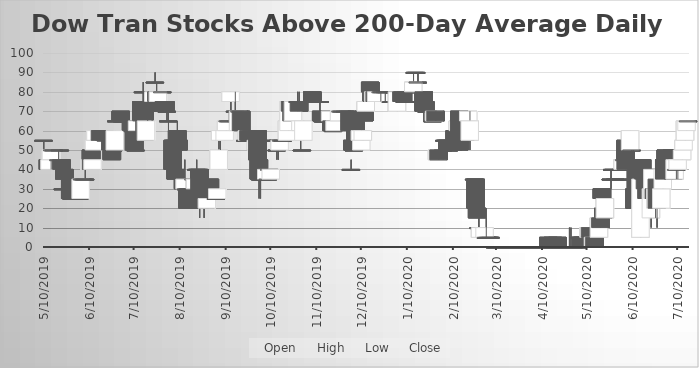
| Category | Open | High | Low | Close |
|---|---|---|---|---|
| 5/10/19 | 55 | 55 | 45 | 55 |
| 5/13/19 | 45 | 45 | 40 | 40 |
| 5/14/19 | 40 | 50 | 40 | 45 |
| 5/15/19 | 45 | 50 | 40 | 50 |
| 5/16/19 | 50 | 50 | 50 | 50 |
| 5/17/19 | 50 | 50 | 50 | 50 |
| 5/20/19 | 45 | 50 | 40 | 45 |
| 5/21/19 | 50 | 50 | 50 | 50 |
| 5/22/19 | 45 | 45 | 35 | 40 |
| 5/23/19 | 30 | 40 | 25 | 30 |
| 5/24/19 | 40 | 40 | 25 | 35 |
| 5/28/19 | 35 | 35 | 25 | 25 |
| 5/29/19 | 25 | 25 | 25 | 25 |
| 5/30/19 | 25 | 25 | 25 | 25 |
| 5/31/19 | 25 | 25 | 25 | 25 |
| 6/3/19 | 25 | 25 | 25 | 25 |
| 6/4/19 | 25 | 35 | 25 | 35 |
| 6/5/19 | 35 | 35 | 35 | 35 |
| 6/6/19 | 35 | 35 | 35 | 35 |
| 6/7/19 | 35 | 40 | 35 | 35 |
| 6/10/19 | 40 | 45 | 40 | 45 |
| 6/11/19 | 50 | 50 | 40 | 40 |
| 6/12/19 | 40 | 45 | 40 | 45 |
| 6/13/19 | 50 | 55 | 50 | 55 |
| 6/14/19 | 55 | 60 | 55 | 60 |
| 6/17/19 | 60 | 60 | 55 | 55 |
| 6/18/19 | 60 | 60 | 60 | 60 |
| 6/19/19 | 60 | 60 | 55 | 60 |
| 6/20/19 | 60 | 60 | 55 | 55 |
| 6/21/19 | 55 | 55 | 55 | 55 |
| 6/24/19 | 55 | 55 | 50 | 50 |
| 6/25/19 | 50 | 55 | 45 | 45 |
| 6/26/19 | 50 | 50 | 50 | 50 |
| 6/27/19 | 50 | 60 | 50 | 60 |
| 6/28/19 | 65 | 65 | 65 | 65 |
| 7/1/19 | 70 | 70 | 65 | 65 |
| 7/2/19 | 65 | 65 | 65 | 65 |
| 7/3/19 | 65 | 65 | 65 | 65 |
| 7/5/19 | 65 | 65 | 65 | 65 |
| 7/8/19 | 65 | 65 | 60 | 60 |
| 7/9/19 | 60 | 60 | 60 | 60 |
| 7/10/19 | 60 | 60 | 50 | 50 |
| 7/11/19 | 50 | 55 | 50 | 50 |
| 7/12/19 | 60 | 65 | 60 | 65 |
| 7/15/19 | 75 | 75 | 60 | 65 |
| 7/16/19 | 80 | 85 | 75 | 80 |
| 7/17/19 | 75 | 75 | 55 | 55 |
| 7/18/19 | 55 | 70 | 55 | 65 |
| 7/19/19 | 75 | 75 | 65 | 70 |
| 7/22/19 | 75 | 75 | 65 | 70 |
| 7/23/19 | 75 | 80 | 70 | 80 |
| 7/24/19 | 85 | 90 | 85 | 85 |
| 7/25/19 | 80 | 85 | 75 | 75 |
| 7/26/19 | 75 | 80 | 75 | 80 |
| 7/29/19 | 80 | 80 | 80 | 80 |
| 7/30/19 | 75 | 75 | 70 | 75 |
| 7/31/19 | 75 | 75 | 70 | 70 |
| 8/1/19 | 70 | 75 | 65 | 70 |
| 8/2/19 | 65 | 70 | 60 | 65 |
| 8/5/19 | 55 | 55 | 35 | 40 |
| 8/6/19 | 55 | 55 | 35 | 50 |
| 8/7/19 | 40 | 40 | 35 | 35 |
| 8/8/19 | 60 | 65 | 45 | 55 |
| 8/9/19 | 55 | 60 | 40 | 50 |
| 8/12/19 | 35 | 35 | 30 | 30 |
| 8/13/19 | 30 | 45 | 30 | 35 |
| 8/14/19 | 30 | 35 | 30 | 30 |
| 8/15/19 | 30 | 30 | 20 | 20 |
| 8/16/19 | 30 | 30 | 30 | 30 |
| 8/19/19 | 35 | 40 | 35 | 35 |
| 8/20/19 | 30 | 35 | 30 | 35 |
| 8/21/19 | 40 | 45 | 35 | 40 |
| 8/22/19 | 40 | 40 | 40 | 40 |
| 8/23/19 | 40 | 40 | 15 | 20 |
| 8/26/19 | 25 | 25 | 15 | 25 |
| 8/27/19 | 25 | 25 | 20 | 20 |
| 8/28/19 | 20 | 25 | 20 | 25 |
| 8/29/19 | 30 | 30 | 25 | 30 |
| 8/30/19 | 35 | 35 | 30 | 30 |
| 9/3/19 | 25 | 30 | 25 | 25 |
| 9/4/19 | 25 | 30 | 25 | 30 |
| 9/5/19 | 40 | 55 | 40 | 50 |
| 9/6/19 | 55 | 60 | 50 | 60 |
| 9/9/19 | 55 | 60 | 55 | 60 |
| 9/10/19 | 60 | 65 | 60 | 65 |
| 9/11/19 | 65 | 65 | 65 | 65 |
| 9/12/19 | 65 | 70 | 65 | 65 |
| 9/13/19 | 75 | 80 | 70 | 80 |
| 9/16/19 | 70 | 80 | 65 | 70 |
| 9/17/19 | 65 | 70 | 60 | 65 |
| 9/18/19 | 60 | 70 | 60 | 70 |
| 9/19/19 | 70 | 70 | 65 | 70 |
| 9/20/19 | 70 | 70 | 60 | 60 |
| 9/23/19 | 55 | 60 | 55 | 55 |
| 9/24/19 | 55 | 60 | 55 | 60 |
| 9/25/19 | 60 | 60 | 50 | 55 |
| 9/26/19 | 55 | 60 | 50 | 55 |
| 9/27/19 | 60 | 60 | 50 | 55 |
| 9/30/19 | 50 | 60 | 50 | 55 |
| 10/1/19 | 60 | 60 | 45 | 45 |
| 10/2/19 | 45 | 45 | 25 | 35 |
| 10/3/19 | 35 | 35 | 25 | 35 |
| 10/4/19 | 35 | 35 | 35 | 35 |
| 10/7/19 | 35 | 40 | 35 | 40 |
| 10/8/19 | 35 | 40 | 35 | 35 |
| 10/9/19 | 40 | 40 | 40 | 40 |
| 10/10/19 | 35 | 40 | 35 | 40 |
| 10/11/19 | 55 | 55 | 55 | 55 |
| 10/14/19 | 50 | 55 | 45 | 50 |
| 10/15/19 | 55 | 55 | 45 | 55 |
| 10/16/19 | 50 | 55 | 50 | 55 |
| 10/17/19 | 55 | 55 | 55 | 55 |
| 10/18/19 | 55 | 55 | 55 | 55 |
| 10/21/19 | 55 | 65 | 55 | 65 |
| 10/22/19 | 60 | 75 | 60 | 75 |
| 10/23/19 | 75 | 75 | 65 | 70 |
| 10/24/19 | 70 | 70 | 65 | 65 |
| 10/25/19 | 65 | 75 | 65 | 75 |
| 10/28/19 | 75 | 80 | 70 | 75 |
| 10/29/19 | 75 | 80 | 70 | 70 |
| 10/30/19 | 60 | 65 | 50 | 65 |
| 10/31/19 | 50 | 50 | 50 | 50 |
| 11/1/19 | 55 | 65 | 55 | 65 |
| 11/4/19 | 75 | 75 | 75 | 75 |
| 11/5/19 | 75 | 80 | 75 | 75 |
| 11/6/19 | 75 | 75 | 75 | 75 |
| 11/7/19 | 80 | 80 | 75 | 75 |
| 11/8/19 | 75 | 75 | 75 | 75 |
| 11/11/19 | 75 | 75 | 75 | 75 |
| 11/12/19 | 75 | 75 | 70 | 75 |
| 11/13/19 | 70 | 70 | 65 | 65 |
| 11/14/19 | 65 | 65 | 65 | 65 |
| 11/15/19 | 65 | 65 | 65 | 65 |
| 11/18/19 | 65 | 65 | 65 | 65 |
| 11/19/19 | 65 | 70 | 65 | 70 |
| 11/20/19 | 65 | 70 | 60 | 60 |
| 11/21/19 | 60 | 60 | 60 | 60 |
| 11/22/19 | 60 | 65 | 60 | 65 |
| 11/25/19 | 65 | 70 | 65 | 70 |
| 11/26/19 | 70 | 70 | 70 | 70 |
| 11/27/19 | 70 | 70 | 70 | 70 |
| 11/29/19 | 70 | 70 | 65 | 70 |
| 12/2/19 | 70 | 70 | 60 | 60 |
| 12/3/19 | 40 | 45 | 40 | 40 |
| 12/4/19 | 55 | 65 | 50 | 50 |
| 12/5/19 | 50 | 50 | 50 | 50 |
| 12/6/19 | 65 | 65 | 55 | 55 |
| 12/9/19 | 55 | 65 | 50 | 60 |
| 12/10/19 | 50 | 65 | 50 | 55 |
| 12/11/19 | 55 | 60 | 55 | 60 |
| 12/12/19 | 70 | 80 | 65 | 65 |
| 12/13/19 | 70 | 80 | 65 | 75 |
| 12/16/19 | 85 | 85 | 80 | 80 |
| 12/17/19 | 80 | 80 | 75 | 75 |
| 12/18/19 | 75 | 80 | 75 | 80 |
| 12/19/19 | 80 | 80 | 75 | 75 |
| 12/20/19 | 75 | 80 | 75 | 80 |
| 12/23/19 | 80 | 80 | 75 | 80 |
| 12/24/19 | 80 | 80 | 80 | 80 |
| 12/26/19 | 80 | 80 | 75 | 80 |
| 12/27/19 | 80 | 80 | 80 | 80 |
| 12/30/19 | 75 | 75 | 75 | 75 |
| 12/31/19 | 75 | 80 | 75 | 75 |
| 1/2/20 | 80 | 80 | 75 | 80 |
| 1/3/20 | 70 | 80 | 70 | 80 |
| 1/6/20 | 80 | 80 | 75 | 75 |
| 1/7/20 | 80 | 80 | 75 | 75 |
| 1/8/20 | 75 | 80 | 75 | 75 |
| 1/9/20 | 80 | 80 | 80 | 80 |
| 1/10/20 | 75 | 80 | 75 | 75 |
| 1/13/20 | 75 | 75 | 75 | 75 |
| 1/14/20 | 80 | 90 | 80 | 85 |
| 1/15/20 | 90 | 90 | 90 | 90 |
| 1/16/20 | 90 | 90 | 90 | 90 |
| 1/17/20 | 85 | 90 | 85 | 85 |
| 1/21/20 | 80 | 80 | 65 | 70 |
| 1/22/20 | 75 | 75 | 70 | 70 |
| 1/23/20 | 70 | 70 | 70 | 70 |
| 1/24/20 | 70 | 70 | 70 | 70 |
| 1/27/20 | 65 | 70 | 65 | 65 |
| 1/28/20 | 65 | 70 | 65 | 70 |
| 1/29/20 | 70 | 70 | 65 | 65 |
| 1/30/20 | 45 | 50 | 45 | 50 |
| 1/31/20 | 50 | 50 | 45 | 45 |
| 2/3/20 | 50 | 50 | 45 | 50 |
| 2/4/20 | 55 | 55 | 55 | 55 |
| 2/5/20 | 55 | 60 | 55 | 55 |
| 2/6/20 | 55 | 60 | 50 | 50 |
| 2/7/20 | 50 | 55 | 50 | 50 |
| 2/10/20 | 55 | 55 | 50 | 50 |
| 2/11/20 | 60 | 60 | 55 | 55 |
| 2/12/20 | 60 | 60 | 60 | 60 |
| 2/13/20 | 60 | 65 | 55 | 65 |
| 2/14/20 | 70 | 70 | 50 | 50 |
| 2/18/20 | 60 | 60 | 55 | 55 |
| 2/19/20 | 65 | 65 | 55 | 65 |
| 2/20/20 | 65 | 70 | 65 | 70 |
| 2/21/20 | 55 | 70 | 50 | 65 |
| 2/24/20 | 35 | 35 | 30 | 35 |
| 2/25/20 | 35 | 35 | 20 | 20 |
| 2/26/20 | 20 | 25 | 15 | 15 |
| 2/27/20 | 10 | 20 | 5 | 10 |
| 2/28/20 | 5 | 10 | 5 | 10 |
| 3/2/20 | 5 | 10 | 5 | 10 |
| 3/3/20 | 5 | 15 | 5 | 5 |
| 3/4/20 | 5 | 5 | 5 | 5 |
| 3/5/20 | 5 | 5 | 5 | 5 |
| 3/6/20 | 5 | 5 | 5 | 5 |
| 3/9/20 | 0.01 | 0.01 | 0.01 | 0.01 |
| 3/10/20 | 0.01 | 0.01 | 0.01 | 0.01 |
| 3/11/20 | 0.01 | 0.01 | 0.01 | 0.01 |
| 3/12/20 | 0.01 | 0.01 | 0.01 | 0.01 |
| 3/13/20 | 0.01 | 0.01 | 0.01 | 0.01 |
| 3/16/20 | 0.01 | 0.01 | 0.01 | 0.01 |
| 3/17/20 | 0.01 | 0.01 | 0.01 | 0.01 |
| 3/18/20 | 0.01 | 0.01 | 0.01 | 0.01 |
| 3/19/20 | 0.01 | 0.01 | 0.01 | 0.01 |
| 3/20/20 | 0.01 | 0.01 | 0.01 | 0.01 |
| 3/23/20 | 0.01 | 0.01 | 0.01 | 0.01 |
| 3/24/20 | 0.01 | 0.01 | 0.01 | 0.01 |
| 3/25/20 | 0.01 | 0.01 | 0.01 | 0.01 |
| 3/26/20 | 0.01 | 0.01 | 0.01 | 0.01 |
| 3/27/20 | 0.01 | 0.01 | 0.01 | 0.01 |
| 3/30/20 | 0.01 | 0.01 | 0.01 | 0.01 |
| 3/31/20 | 0.01 | 0.01 | 0.01 | 0.01 |
| 4/1/20 | 0.01 | 0.01 | 0.01 | 0.01 |
| 4/2/20 | 0.01 | 0.01 | 0.01 | 0.01 |
| 4/3/20 | 0.01 | 0.01 | 0.01 | 0.01 |
| 4/6/20 | 0.01 | 0.01 | 0.01 | 0.01 |
| 4/7/20 | 0.01 | 0.01 | 0.01 | 0.01 |
| 4/8/20 | 0.01 | 5 | 0.01 | 0.01 |
| 4/9/20 | 0.01 | 5 | 0.01 | 0.01 |
| 4/13/20 | 0.01 | 0.01 | 0.01 | 0.01 |
| 4/14/20 | 5 | 5 | 0.01 | 0.01 |
| 4/15/20 | 0.01 | 0.01 | 0.01 | 0.01 |
| 4/16/20 | 0.01 | 0.01 | 0.01 | 0.01 |
| 4/17/20 | 5 | 5 | 0.01 | 5 |
| 4/20/20 | 5 | 5 | 0.01 | 0.01 |
| 4/21/20 | 0.01 | 0.01 | 0.01 | 0.01 |
| 4/22/20 | 0.01 | 0.01 | 0.01 | 0.01 |
| 4/23/20 | 0.01 | 0.01 | 0.01 | 0.01 |
| 4/24/20 | 0.01 | 0.01 | 0.01 | 0.01 |
| 4/27/20 | 0.01 | 0.01 | 0.01 | 0.01 |
| 4/28/20 | 0.01 | 10 | 0.01 | 0.01 |
| 4/29/20 | 0.01 | 10 | 0.01 | 0.01 |
| 4/30/20 | 0.01 | 0.01 | 0.01 | 0.01 |
| 5/1/20 | 0.01 | 0.01 | 0.01 | 0.01 |
| 5/4/20 | 0.01 | 0.01 | 0.01 | 0.01 |
| 5/5/20 | 5 | 5 | 0.01 | 5 |
| 5/6/20 | 5 | 5 | 0.01 | 0.01 |
| 5/7/20 | 5 | 5 | 5 | 5 |
| 5/8/20 | 5 | 5 | 5 | 5 |
| 5/11/20 | 5 | 10 | 5 | 10 |
| 5/12/20 | 10 | 10 | 5 | 5 |
| 5/13/20 | 5 | 5 | 0.01 | 5 |
| 5/14/20 | 0.01 | 5 | 0.01 | 5 |
| 5/15/20 | 5 | 5 | 0.01 | 0.01 |
| 5/18/20 | 5 | 15 | 0.01 | 15 |
| 5/19/20 | 15 | 20 | 10 | 10 |
| 5/20/20 | 30 | 30 | 20 | 25 |
| 5/21/20 | 20 | 20 | 15 | 15 |
| 5/22/20 | 15 | 25 | 15 | 25 |
| 5/26/20 | 35 | 40 | 30 | 35 |
| 5/27/20 | 40 | 40 | 40 | 40 |
| 5/28/20 | 40 | 40 | 40 | 40 |
| 5/29/20 | 35 | 35 | 35 | 35 |
| 6/1/20 | 35 | 35 | 35 | 35 |
| 6/2/20 | 40 | 40 | 40 | 40 |
| 6/3/20 | 40 | 45 | 40 | 45 |
| 6/4/20 | 45 | 45 | 45 | 45 |
| 6/5/20 | 55 | 55 | 40 | 40 |
| 6/8/20 | 50 | 60 | 50 | 60 |
| 6/9/20 | 50 | 50 | 45 | 50 |
| 6/10/20 | 45 | 50 | 40 | 45 |
| 6/11/20 | 30 | 40 | 20 | 20 |
| 6/12/20 | 40 | 40 | 10 | 30 |
| 6/15/20 | 5 | 40 | 5 | 35 |
| 6/16/20 | 45 | 45 | 40 | 40 |
| 6/17/20 | 40 | 40 | 35 | 35 |
| 6/18/20 | 35 | 40 | 25 | 30 |
| 6/19/20 | 40 | 45 | 20 | 25 |
| 6/22/20 | 15 | 30 | 10 | 30 |
| 6/23/20 | 25 | 40 | 25 | 40 |
| 6/24/20 | 30 | 35 | 25 | 25 |
| 6/25/20 | 20 | 30 | 15 | 30 |
| 6/26/20 | 35 | 35 | 10 | 20 |
| 6/29/20 | 20 | 35 | 20 | 30 |
| 6/30/20 | 30 | 40 | 30 | 40 |
| 7/1/20 | 45 | 45 | 35 | 35 |
| 7/2/20 | 50 | 50 | 40 | 40 |
| 7/6/20 | 50 | 50 | 50 | 50 |
| 7/7/20 | 45 | 45 | 35 | 35 |
| 7/8/20 | 35 | 50 | 35 | 45 |
| 7/9/20 | 40 | 40 | 35 | 40 |
| 7/10/20 | 40 | 45 | 35 | 45 |
| 7/13/20 | 45 | 55 | 45 | 50 |
| 7/14/20 | 50 | 55 | 50 | 55 |
| 7/15/20 | 55 | 65 | 55 | 65 |
| 7/16/20 | 60 | 65 | 60 | 65 |
| 7/17/20 | 65 | 65 | 65 | 65 |